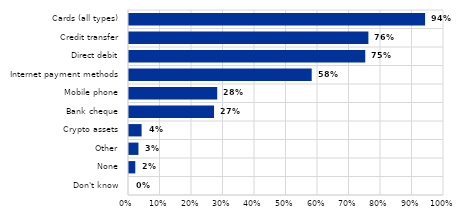
| Category | Series 0 |
|---|---|
| Don't know | 0 |
| None | 0.02 |
| Other | 0.03 |
| Crypto assets | 0.04 |
| Bank cheque | 0.27 |
| Mobile phone | 0.28 |
| Internet payment methods | 0.58 |
| Direct debit | 0.75 |
| Credit transfer | 0.76 |
| Cards (all types) | 0.94 |